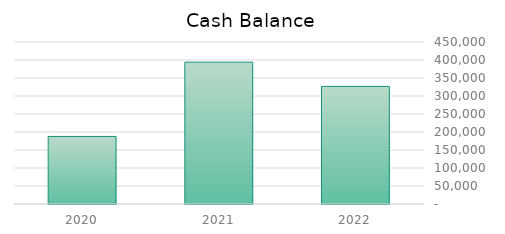
| Category | Cash Balance |
|---|---|
| 2022.0 | 326674 |
| 2021.0 | 393980 |
| 2020.0 | 187624 |